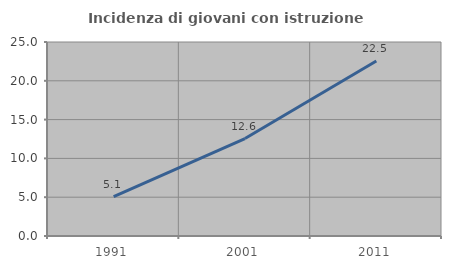
| Category | Incidenza di giovani con istruzione universitaria |
|---|---|
| 1991.0 | 5.085 |
| 2001.0 | 12.558 |
| 2011.0 | 22.543 |